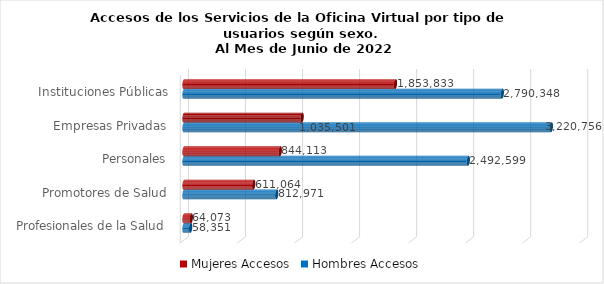
| Category | Mujeres | Hombres |
|---|---|---|
| Instituciones Públicas | 1853833 | 2790348 |
| Empresas Privadas | 1035501 | 3220756 |
| Personales | 844113 | 2492599 |
| Promotores de Salud | 611064 | 812971 |
| Profesionales de la Salud | 64073 | 58351 |